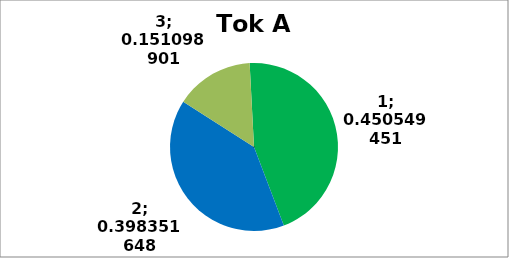
| Category | Series 0 |
|---|---|
| 0 | 164 |
| 1 | 145 |
| 2 | 55 |